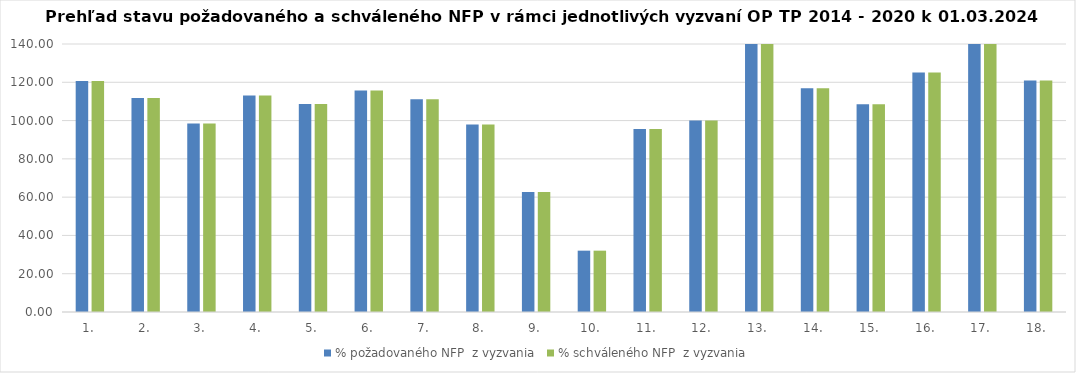
| Category | % požadovaného NFP  z vyzvania | % schváleného NFP  z vyzvania |
|---|---|---|
| 1. | 120.673 | 120.673 |
| 2. | 111.84 | 111.84 |
| 3. | 98.474 | 98.474 |
| 4. | 113.162 | 113.162 |
| 5. | 108.721 | 108.721 |
| 6. | 115.745 | 115.745 |
| 7. | 111.089 | 111.089 |
| 8. | 97.998 | 97.998 |
| 9. | 62.727 | 62.727 |
| 10. | 32.041 | 32.041 |
| 11. | 95.621 | 95.621 |
| 12. | 100.009 | 100.009 |
| 13. | 151.956 | 151.956 |
| 14. | 116.9 | 116.9 |
| 15. | 108.564 | 108.564 |
| 16. | 125.057 | 125.057 |
| 17. | 171.931 | 171.931 |
| 18. | 120.879 | 120.879 |